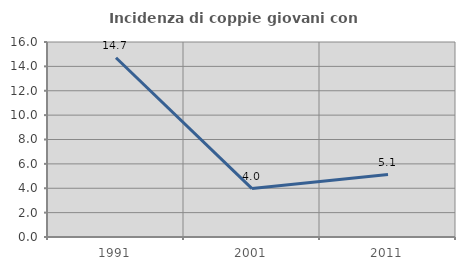
| Category | Incidenza di coppie giovani con figli |
|---|---|
| 1991.0 | 14.706 |
| 2001.0 | 3.974 |
| 2011.0 | 5.128 |